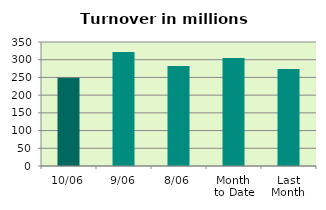
| Category | Series 0 |
|---|---|
| 10/06 | 248.801 |
| 9/06 | 321.893 |
| 8/06 | 282.236 |
| Month 
to Date | 305.001 |
| Last
Month | 273.813 |